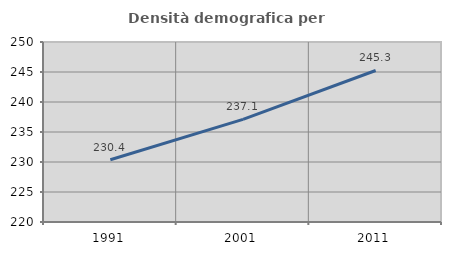
| Category | Densità demografica |
|---|---|
| 1991.0 | 230.365 |
| 2001.0 | 237.1 |
| 2011.0 | 245.251 |